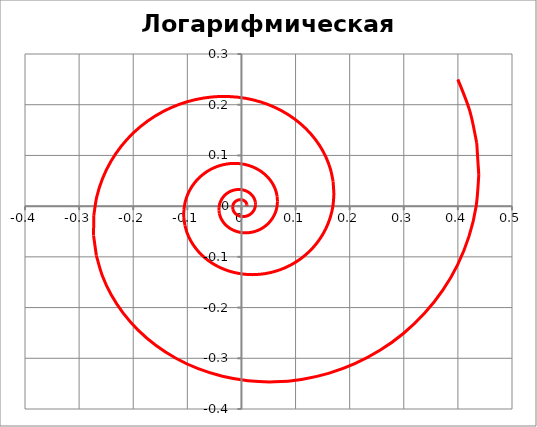
| Category | Логарифмическая спираль |
|---|---|
| 0.01 | 0 |
| 0.010112269090101692 | 0.001 |
| 0.010023821440448848 | 0.003 |
| 0.009727868463744389 | 0.004 |
| 0.009221548462024342 | 0.006 |
| 0.008506152769941709 | 0.007 |
| 0.007587277166670408 | 0.008 |
| 0.0064748922823424275 | 0.01 |
| 0.005183328102876865 | 0.011 |
| 0.0037311692134581577 | 0.011 |
| 0.0021410590913255433 | 0.012 |
| 0.0004394135347300216 | 0.013 |
| -0.0013439548346745542 | 0.013 |
| -0.0031762971685458307 | 0.013 |
| -0.00502246836694892 | 0.012 |
| -0.006845538853124231 | 0.012 |
| -0.00860746878577914 | 0.011 |
| -0.010269833677300126 | 0.01 |
| -0.011794588869615208 | 0.009 |
| -0.013144858992918135 | 0.007 |
| -0.014285737431190281 | 0.005 |
| -0.015185079974440702 | 0.003 |
| -0.015814276278987825 | 0.001 |
| -0.016148982507490174 | -0.001 |
| -0.016169798598088907 | -0.003 |
| -0.015862874029373496 | -0.006 |
| -0.01522042671097266 | -0.008 |
| -0.014241160737686703 | -0.01 |
| -0.012930570190453376 | -0.012 |
| -0.011301117935128497 | -0.014 |
| -0.009372280437926699 | -0.016 |
| -0.007170451955221133 | -0.018 |
| -0.004728704029301432 | -0.019 |
| -0.002086398988379589 | -0.02 |
| 0.0007113409393673869 | -0.02 |
| 0.003614304284600721 | -0.02 |
| 0.006567993117303926 | -0.02 |
| 0.00951454728527433 | -0.02 |
| 0.012393776522299806 | -0.018 |
| 0.015144284064104622 | -0.017 |
| 0.01770466285044323 | -0.015 |
| 0.020014743107076554 | -0.013 |
| 0.022016868149979805 | -0.01 |
| 0.023657173689920517 | -0.007 |
| 0.024886844786864447 | -0.003 |
| 0.025663323952081353 | 0 |
| 0.025951443754989863 | 0.004 |
| 0.02572445768640575 | 0.007 |
| 0.024964943974830827 | 0.011 |
| 0.023665558552074827 | 0.015 |
| 0.021829615412090827 | 0.018 |
| 0.019471475184249284 | 0.022 |
| 0.016616725819658507 | 0.025 |
| 0.013302142825405636 | 0.027 |
| 0.009575420424500937 | 0.029 |
| 0.005494669306123636 | 0.031 |
| 0.001127681189070563 | 0.032 |
| -0.003449034829921886 | 0.033 |
| -0.008151434320447053 | 0.033 |
| -0.012889323274009074 | 0.032 |
| -0.017567928121428638 | 0.03 |
| -0.022089625985687818 | 0.028 |
| -0.02635580685945478 | 0.025 |
| -0.030268835504254805 | 0.022 |
| -0.033734077463968795 | 0.018 |
| -0.03666195075910107 | 0.013 |
| -0.038969962662233494 | 0.008 |
| -0.040584689521538014 | 0.003 |
| -0.041443656958621546 | -0.003 |
| -0.04149707796626664 | -0.009 |
| -0.04070940750268702 | -0.015 |
| -0.03906067413726035 | -0.021 |
| -0.036547552146491566 | -0.027 |
| -0.03318414116827313 | -0.032 |
| -0.029002425058987938 | -0.037 |
| -0.02405238690482675 | -0.042 |
| -0.018401763140967555 | -0.046 |
| -0.012135426337747475 | -0.049 |
| -0.0053543933132080765 | -0.051 |
| 0.0018255372967362516 | -0.052 |
| 0.00927550617171038 | -0.053 |
| 0.016855653508441117 | -0.052 |
| 0.024417490923939026 | -0.05 |
| 0.03180655018814805 | -0.047 |
| 0.03886526679594604 | -0.043 |
| 0.0454360498193305 | -0.038 |
| 0.05136448361745928 | -0.032 |
| 0.05650260197431933 | -0.025 |
| 0.0607121712195086 | -0.017 |
| 0.06386791599104695 | -0.009 |
| 0.06586061962694725 | 0 |
| 0.06660003081085235 | 0.009 |
| 0.066017509109784 | 0.019 |
| 0.0640683444671645 | 0.029 |
| 0.06073368956288455 | 0.038 |
| 0.056022049206983456 | 0.047 |
| 0.049970277547830226 | 0.055 |
| 0.04264404177328114 | 0.063 |
| 0.03413772005852397 | 0.07 |
| 0.024573711633134276 | 0.076 |
| 0.014101147841260915 | 0.08 |
| 0.002894004766978636 | 0.083 |
| -0.008851369816229622 | 0.084 |
| -0.020919289963974515 | 0.084 |
| -0.0330782878703998 | 0.082 |
| -0.04508514305471044 | 0.078 |
| -0.05668932276510208 | 0.073 |
| -0.06763776094526759 | 0.065 |
| -0.07767989311979527 | 0.056 |
| -0.08657285581824371 | 0.046 |
| -0.09408675190460658 | 0.034 |
| -0.10000987762014131 | 0.021 |
| -0.1041538034685872 | 0.007 |
| -0.1063581994288035 | -0.007 |
| -0.10649529549130783 | -0.023 |
| -0.10447387126387482 | -0.038 |
| -0.10024267341711979 | -0.053 |
| -0.09379316703909993 | -0.068 |
| -0.08516153648729939 | -0.082 |
| -0.07442986296847699 | -0.095 |
| -0.06172641969593701 | -0.107 |
| -0.04722504087761187 | -0.117 |
| -0.031143537740223607 | -0.125 |
| -0.013741153016371509 | -0.131 |
| 0.004684935503274893 | -0.134 |
| 0.023804031970413066 | -0.135 |
| 0.04325720964111606 | -0.133 |
| 0.0626633979678058 | -0.128 |
| 0.0816261801276577 | -0.121 |
| 0.09974119322684316 | -0.111 |
| 0.11660400656163854 | -0.098 |
| 0.13181833827062364 | -0.082 |
| 0.14500445786024696 | -0.065 |
| 0.1558076117840479 | -0.045 |
| 0.1639063018222553 | -0.023 |
| 0.16902024171711547 | 0 |
| 0.17091781659175026 | 0.024 |
| 0.16942287227938688 | 0.049 |
| 0.1644206679134382 | 0.073 |
| 0.15586283500574488 | 0.097 |
| 0.14377119972582603 | 0.121 |
| 0.12824034206853874 | 0.142 |
| 0.1094387858653804 | 0.162 |
| 0.08760873688473637 | 0.18 |
| 0.06306431223461587 | 0.194 |
| 0.03618823251464756 | 0.205 |
| 0.007426978185384095 | 0.213 |
| -0.02271555710135828 | 0.216 |
| -0.05368585151930055 | 0.215 |
| -0.08488988173982691 | 0.21 |
| -0.11570346316389642 | 0.2 |
| -0.1454836454744914 | 0.186 |
| -0.17358097705318343 | 0.168 |
| -0.1993524261696361 | 0.145 |
| -0.2221747244320424 | 0.118 |
| -0.24145787937270252 | 0.088 |
| -0.2566585887773695 | 0.055 |
| -0.26729327992557644 | 0.019 |
| -0.2729504926901458 | -0.019 |
| -0.27330232675660615 | -0.058 |
| -0.26811468027728624 | -0.098 |
| -0.25725602017262417 | -0.137 |
| -0.2407044430216101 | -0.175 |
| -0.2185528099130561 | -0.211 |
| -0.19101176850690568 | -0.244 |
| -0.1584105105058967 | -0.274 |
| -0.12119515226924385 | -0.3 |
| -0.07992466980412202 | -0.321 |
| -0.035264366133426275 | -0.336 |
| 0.012023101751515006 | -0.344 |
| 0.061089058382242364 | -0.346 |
| 0.11101237842830575 | -0.342 |
| 0.16081510819859834 | -0.33 |
| 0.2094799103587024 | -0.311 |
| 0.25596905531476183 | -0.284 |
| 0.29924463945019386 | -0.251 |
| 0.33828967178640484 | -0.211 |
| 0.3721296376563446 | -0.166 |
| 0.39985412154141553 | -0.115 |
| 0.4206380521452164 | -0.059 |
| 0.4337621217645429 | 0 |
| 0.4386319296376512 | 0.062 |
| 0.4347954056198009 | 0.125 |
| 0.4219580865080153 | 0.188 |
| 0.3999958426842242 | 0.25 |